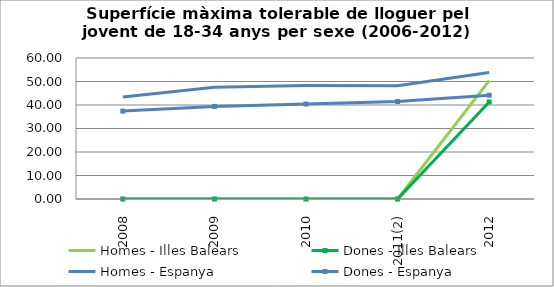
| Category | Homes - Illes Balears | Dones - Illes Balears | Homes - Espanya | Dones - Espanya |
|---|---|---|---|---|
| 2008 | 0 | 0 | 43.4 | 37.4 |
| 2009 | 0 | 0 | 47.6 | 39.4 |
| 2010 | 0 | 0 | 48.3 | 40.4 |
| 2011(2) | 0 | 0 | 48.167 | 41.5 |
| 2012 | 50.4 | 41.3 | 53.8 | 44.2 |